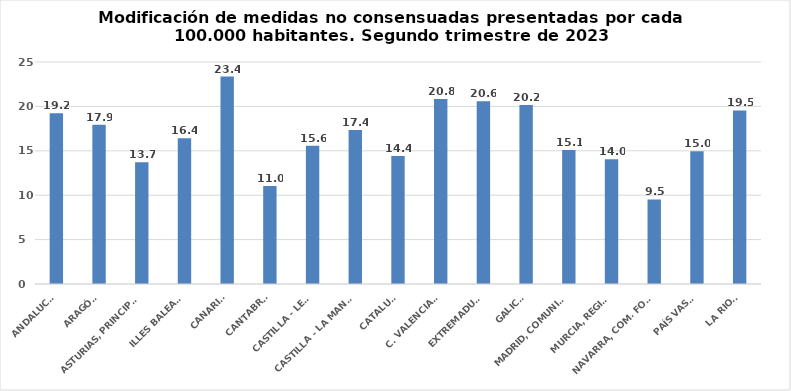
| Category | Series 0 |
|---|---|
| ANDALUCÍA | 19.234 |
| ARAGÓN | 17.935 |
| ASTURIAS, PRINCIPADO | 13.709 |
| ILLES BALEARS | 16.408 |
| CANARIAS | 23.363 |
| CANTABRIA | 11.044 |
| CASTILLA - LEÓN | 15.571 |
| CASTILLA - LA MANCHA | 17.351 |
| CATALUÑA | 14.407 |
| C. VALENCIANA | 20.831 |
| EXTREMADURA | 20.582 |
| GALICIA | 20.15 |
| MADRID, COMUNIDAD | 15.097 |
| MURCIA, REGIÓN | 14.04 |
| NAVARRA, COM. FORAL | 9.521 |
| PAÍS VASCO | 14.956 |
| LA RIOJA | 19.549 |